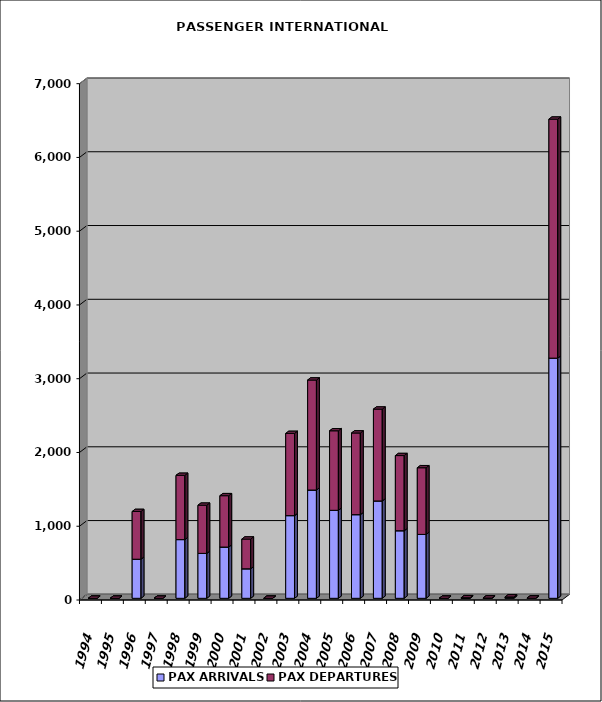
| Category | PAX ARRIVALS | PAX DEPARTURES |
|---|---|---|
| 1994.0 | 0 | 0 |
| 1995.0 | 0 | 0 |
| 1996.0 | 530 | 647 |
| 1997.0 | 0 | 0 |
| 1998.0 | 796 | 871 |
| 1999.0 | 609 | 653 |
| 2000.0 | 695 | 696 |
| 2001.0 | 400 | 403 |
| 2002.0 | 0 | 0 |
| 2003.0 | 1121 | 1114 |
| 2004.0 | 1468 | 1491 |
| 2005.0 | 1193 | 1078 |
| 2006.0 | 1134 | 1107 |
| 2007.0 | 1320 | 1245 |
| 2008.0 | 916 | 1019 |
| 2009.0 | 866 | 904 |
| 2010.0 | 0 | 0 |
| 2011.0 | 4 | 4 |
| 2012.0 | 2 | 2 |
| 2013.0 | 9 | 10 |
| 2014.0 | 0 | 2 |
| 2015.0 | 3256 | 3240 |